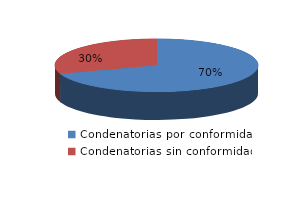
| Category | Series 0 |
|---|---|
| 0 | 845 |
| 1 | 366 |